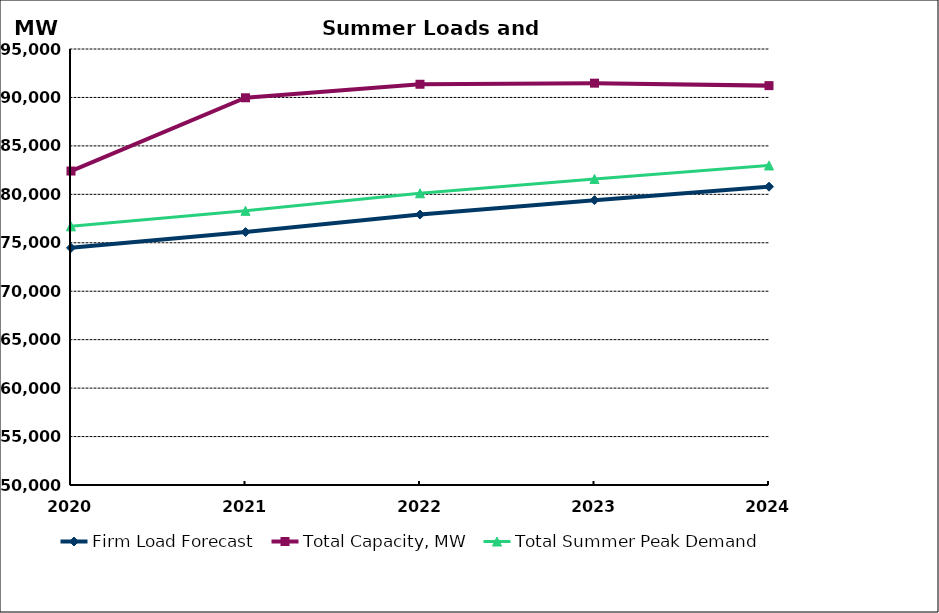
| Category | Firm Load Forecast | Total Capacity, MW | Total Summer Peak Demand |
|---|---|---|---|
| 2020.0 | 74479.516 | 82403.404 | 76695.569 |
| 2021.0 | 76104.809 | 89967.131 | 78298.667 |
| 2022.0 | 77913.734 | 91360.66 | 80107.591 |
| 2023.0 | 79399.403 | 91473.428 | 81593.26 |
| 2024.0 | 80788.241 | 91218.428 | 82982.099 |